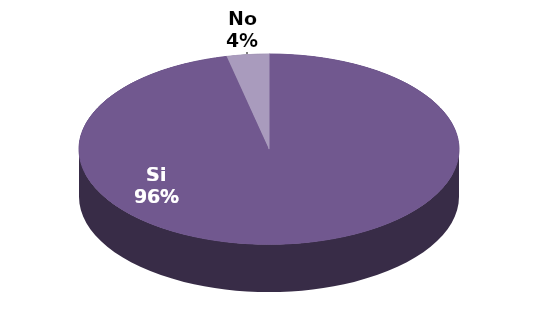
| Category | Series 1 |
|---|---|
| Si | 27 |
| No | 1 |